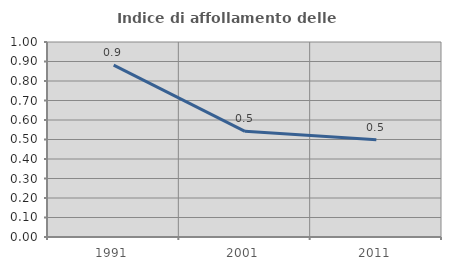
| Category | Indice di affollamento delle abitazioni  |
|---|---|
| 1991.0 | 0.882 |
| 2001.0 | 0.542 |
| 2011.0 | 0.499 |